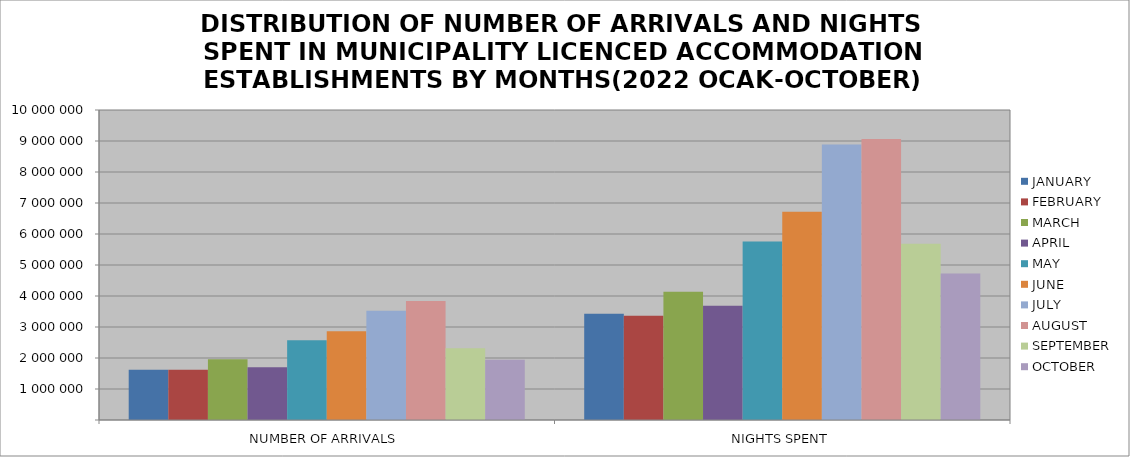
| Category | JANUARY | FEBRUARY | MARCH | APRIL | MAY | JUNE | JULY | AUGUST | SEPTEMBER | OCTOBER |
|---|---|---|---|---|---|---|---|---|---|---|
| NUMBER OF ARRIVALS | 1617436 | 1619305 | 1960867 | 1699422 | 2574819 | 2859746 | 3526528 | 3842457 | 2312458 | 1946191 |
| NIGHTS SPENT | 3427709 | 3362025 | 4136510 | 3684991 | 5758959 | 6716122 | 8890725 | 9063514 | 5685276 | 4729262 |